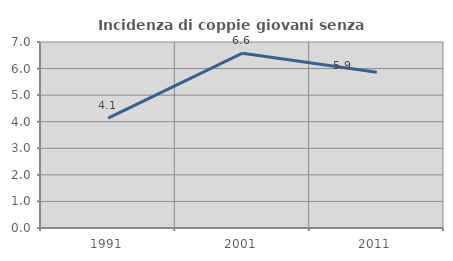
| Category | Incidenza di coppie giovani senza figli |
|---|---|
| 1991.0 | 4.136 |
| 2001.0 | 6.579 |
| 2011.0 | 5.863 |